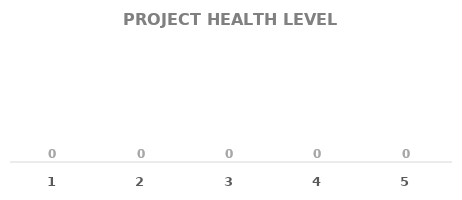
| Category | QTY |
|---|---|
| 1.0 | 0 |
| 2.0 | 0 |
| 3.0 | 0 |
| 4.0 | 0 |
| 5.0 | 0 |